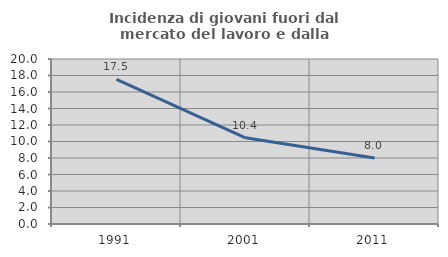
| Category | Incidenza di giovani fuori dal mercato del lavoro e dalla formazione  |
|---|---|
| 1991.0 | 17.544 |
| 2001.0 | 10.448 |
| 2011.0 | 8 |